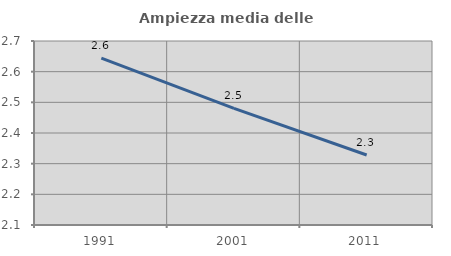
| Category | Ampiezza media delle famiglie |
|---|---|
| 1991.0 | 2.644 |
| 2001.0 | 2.48 |
| 2011.0 | 2.328 |